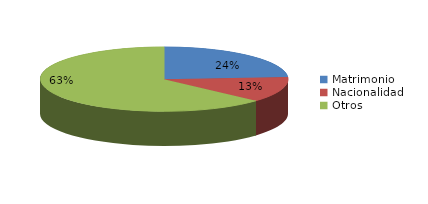
| Category | Series 0 |
|---|---|
| Matrimonio | 2491 |
| Nacionalidad | 1338 |
| Otros | 6598 |